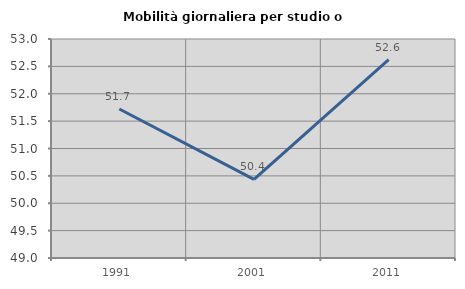
| Category | Mobilità giornaliera per studio o lavoro |
|---|---|
| 1991.0 | 51.721 |
| 2001.0 | 50.436 |
| 2011.0 | 52.623 |